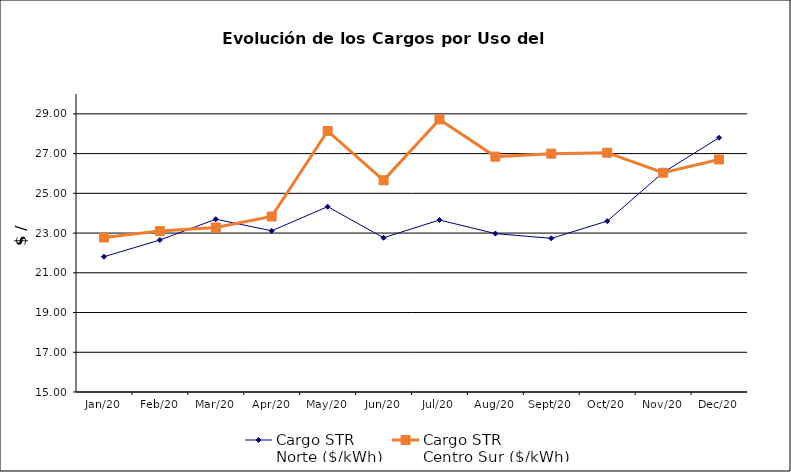
| Category | Cargo STR 
Norte ($/kWh) | Cargo STR 
Centro Sur ($/kWh) |
|---|---|---|
| 2020-01-01 | 21.809 | 22.775 |
| 2020-02-01 | 22.65 | 23.1 |
| 2020-03-01 | 23.698 | 23.281 |
| 2020-04-01 | 23.112 | 23.834 |
| 2020-05-01 | 24.329 | 28.14 |
| 2020-06-01 | 22.764 | 25.657 |
| 2020-07-01 | 23.656 | 28.72 |
| 2020-08-01 | 22.973 | 26.848 |
| 2020-09-01 | 22.734 | 26.998 |
| 2020-10-01 | 23.602 | 27.046 |
| 2020-11-01 | 26.046 | 26.035 |
| 2020-12-01 | 27.798 | 26.703 |